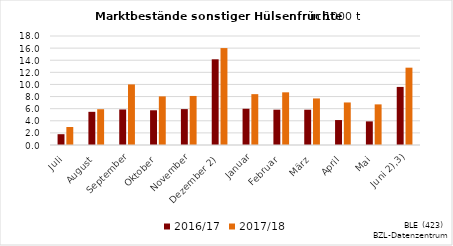
| Category | 2016/17 | 2017/18 |
|---|---|---|
| Juli | 1.783 | 2.968 |
| August | 5.478 | 5.91 |
| September | 5.867 | 10.005 |
| Oktober | 5.734 | 8.027 |
| November | 5.927 | 8.099 |
|  Dezember 2) | 14.152 | 16.006 |
| Januar | 5.987 | 8.398 |
| Februar | 5.829 | 8.698 |
| März | 5.826 | 7.689 |
| April | 4.12 | 7.024 |
| Mai | 3.9 | 6.708 |
|    Juni 2),3) | 9.591 | 12.769 |